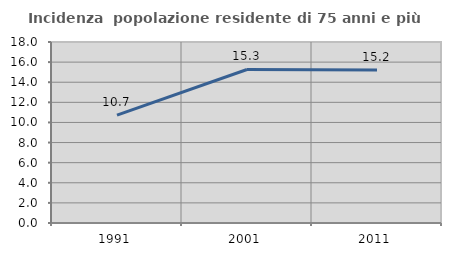
| Category | Incidenza  popolazione residente di 75 anni e più |
|---|---|
| 1991.0 | 10.733 |
| 2001.0 | 15.269 |
| 2011.0 | 15.21 |